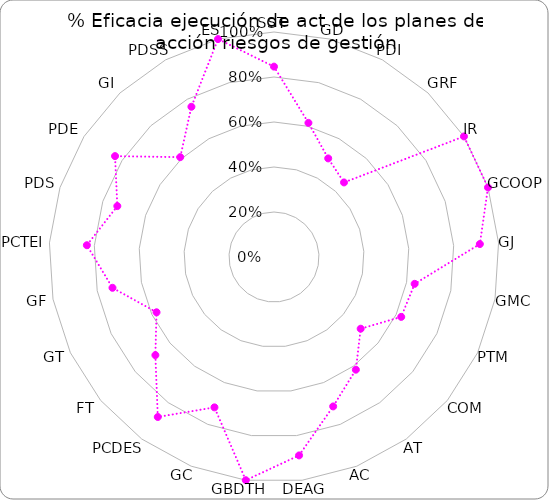
| Category | Series 0 |
|---|---|
| SST | 0.846 |
| GD | 0.615 |
| PDI | 0.5 |
| GRF | 0.455 |
| IR | 1 |
| GCOOP | 1 |
| GJ | 0.917 |
| GMC | 0.636 |
| PTM | 0.625 |
| COM | 0.5 |
| AT | 0.619 |
| AC | 0.714 |
| DEAG | 0.889 |
| GBDTH | 1 |
| GC | 0.719 |
| PCDES | 0.879 |
| FT | 0.684 |
| GT | 0.577 |
| GF | 0.731 |
| PCTEI | 0.833 |
| PDS | 0.732 |
| PDE | 0.837 |
| GI | 0.609 |
| PDSS | 0.762 |
| ES | 1 |